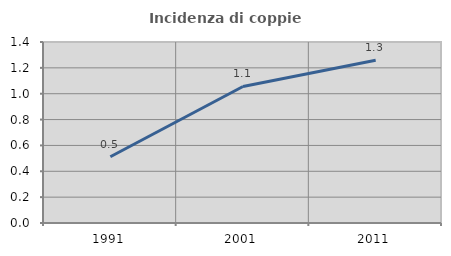
| Category | Incidenza di coppie miste |
|---|---|
| 1991.0 | 0.512 |
| 2001.0 | 1.056 |
| 2011.0 | 1.258 |